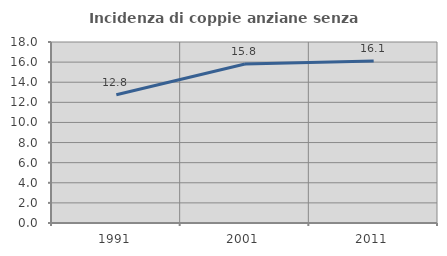
| Category | Incidenza di coppie anziane senza figli  |
|---|---|
| 1991.0 | 12.75 |
| 2001.0 | 15.806 |
| 2011.0 | 16.12 |